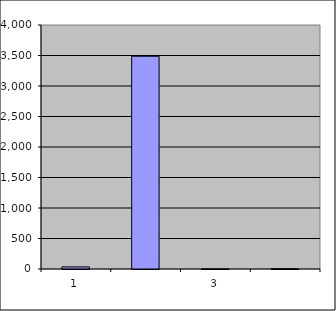
| Category | Series 0 |
|---|---|
| 0 | 34.5 |
| 1 | 3487.573 |
| 2 | 0.975 |
| 3 | 4.23 |